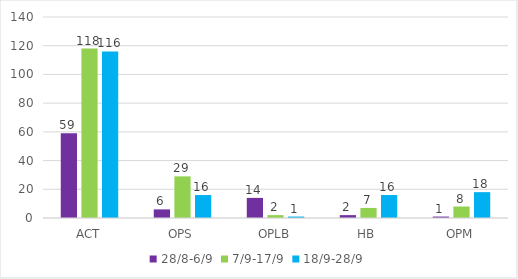
| Category | 28/8-6/9 | 7/9-17/9 | 18/9-28/9 |
|---|---|---|---|
| ACT | 59 | 118 | 116 |
| OPS | 6 | 29 | 16 |
| OPLB | 14 | 2 | 1 |
| HB | 2 | 7 | 16 |
| OPM | 1 | 8 | 18 |